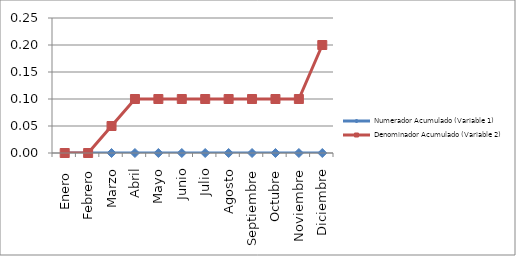
| Category | Numerador Acumulado (Variable 1) | Denominador Acumulado (Variable 2) |
|---|---|---|
| Enero  | 0 | 0 |
| Febrero | 0 | 0 |
| Marzo | 0 | 0.05 |
| Abril | 0 | 0.1 |
| Mayo | 0 | 0.1 |
| Junio | 0 | 0.1 |
| Julio | 0 | 0.1 |
| Agosto | 0 | 0.1 |
| Septiembre | 0 | 0.1 |
| Octubre | 0 | 0.1 |
| Noviembre | 0 | 0.1 |
| Diciembre | 0 | 0.2 |